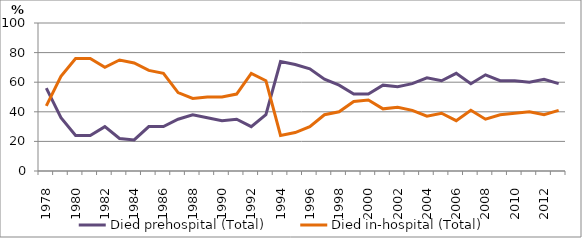
| Category | Died prehospital (Total) | Died in-hospital (Total) |
|---|---|---|
| 1978.0 | 56 | 44 |
| 1979.0 | 36 | 64 |
| 1980.0 | 24 | 76 |
| 1981.0 | 24 | 76 |
| 1982.0 | 30 | 70 |
| 1983.0 | 22 | 75 |
| 1984.0 | 21 | 73 |
| 1985.0 | 30 | 68 |
| 1986.0 | 30 | 66 |
| 1987.0 | 35 | 53 |
| 1988.0 | 38 | 49 |
| 1989.0 | 36 | 50 |
| 1990.0 | 34 | 50 |
| 1991.0 | 35 | 52 |
| 1992.0 | 30 | 66 |
| 1993.0 | 38 | 61 |
| 1994.0 | 74 | 24 |
| 1995.0 | 72 | 26 |
| 1996.0 | 69 | 30 |
| 1997.0 | 62 | 38 |
| 1998.0 | 58 | 40 |
| 1999.0 | 52 | 47 |
| 2000.0 | 52 | 48 |
| 2001.0 | 58 | 42 |
| 2002.0 | 57 | 43 |
| 2003.0 | 59 | 41 |
| 2004.0 | 63 | 37 |
| 2005.0 | 61 | 39 |
| 2006.0 | 66 | 34 |
| 2007.0 | 59 | 41 |
| 2008.0 | 65 | 35 |
| 2009.0 | 61 | 38 |
| 2010.0 | 61 | 39 |
| 2011.0 | 60 | 40 |
| 2012.0 | 62 | 38 |
| 2013.0 | 59 | 41 |